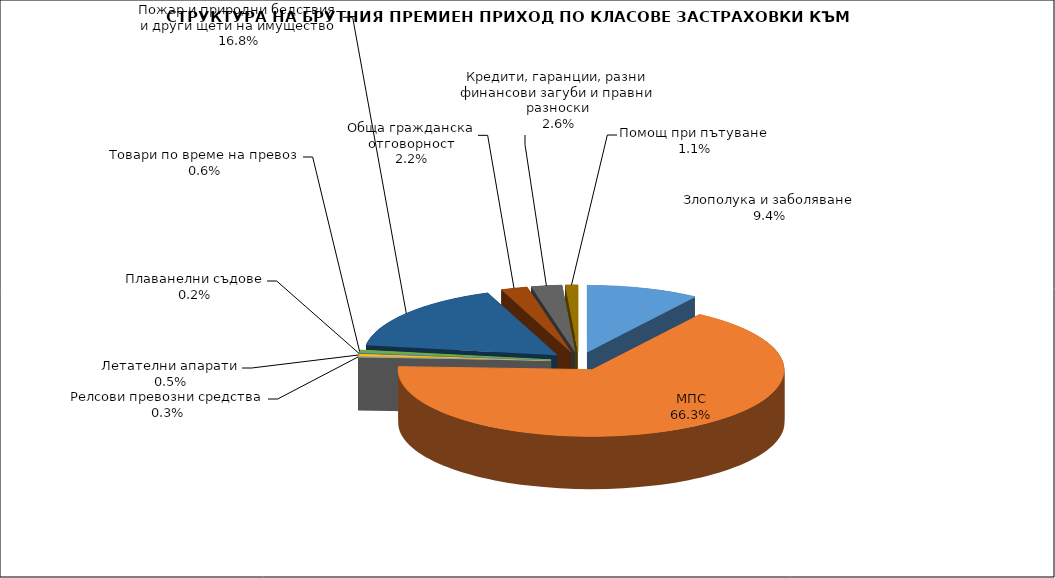
| Category | Злополука и заболяване |
|---|---|
| Злополука и заболяване | 0.094 |
| МПС | 0.663 |
| Релсови превозни средства | 0.003 |
| Летателни апарати | 0.005 |
| Плаванелни съдове | 0.002 |
| Товари по време на превоз | 0.006 |
| Пожар и природни бедствия и други щети на имущество | 0.168 |
| Обща гражданска отговорност | 0.022 |
| Кредити, гаранции, разни финансови загуби и правни разноски | 0.026 |
| Помощ при пътуване | 0.011 |